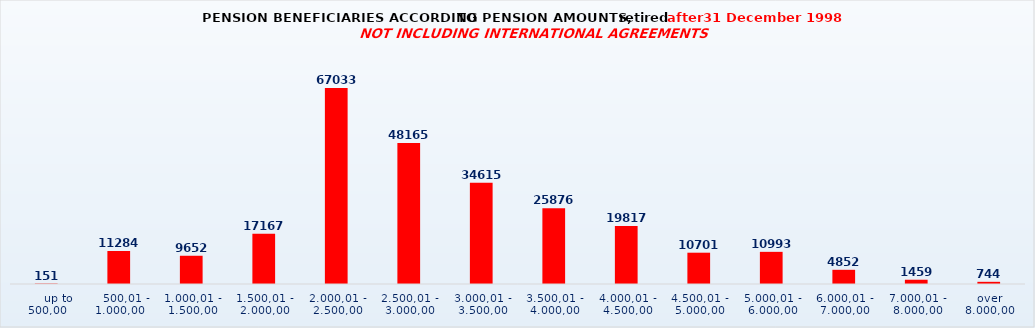
| Category | Series 0 |
|---|---|
|      up to 500,00 | 151 |
|    500,01 - 1.000,00 | 11284 |
| 1.000,01 - 1.500,00 | 9652 |
| 1.500,01 - 2.000,00 | 17167 |
| 2.000,01 - 2.500,00 | 67033 |
| 2.500,01 - 3.000,00 | 48165 |
| 3.000,01 - 3.500,00 | 34615 |
| 3.500,01 - 4.000,00 | 25876 |
| 4.000,01 - 4.500,00 | 19817 |
| 4.500,01 - 5.000,00 | 10701 |
| 5.000,01 - 6.000,00 | 10993 |
| 6.000,01 - 7.000,00 | 4852 |
| 7.000,01 - 8.000,00 | 1459 |
| over 8.000,00 | 744 |